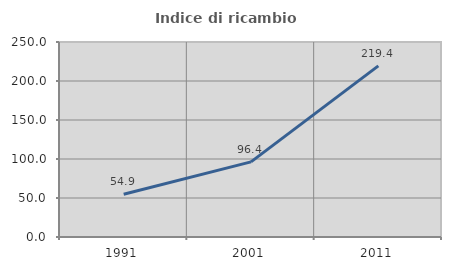
| Category | Indice di ricambio occupazionale  |
|---|---|
| 1991.0 | 54.878 |
| 2001.0 | 96.364 |
| 2011.0 | 219.355 |